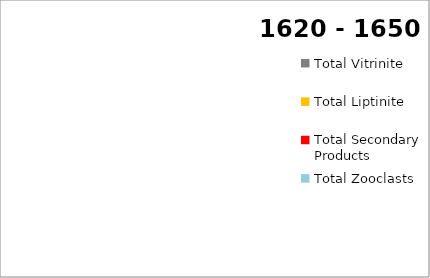
| Category | Series 0 |
|---|---|
| Total Vitrinite | 0 |
| Total Liptinite | 0 |
| Total  Inertinite | 0 |
| Total Secondary Products | 0 |
| Total Zooclasts | 0 |